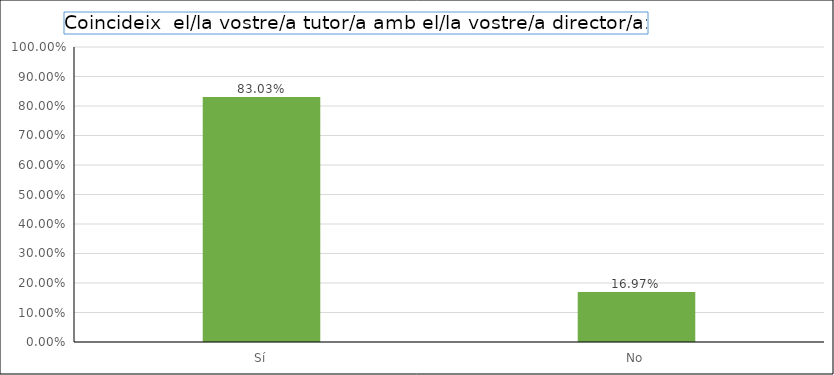
| Category | Series 0 |
|---|---|
| Sí | 0.83 |
| No | 0.17 |